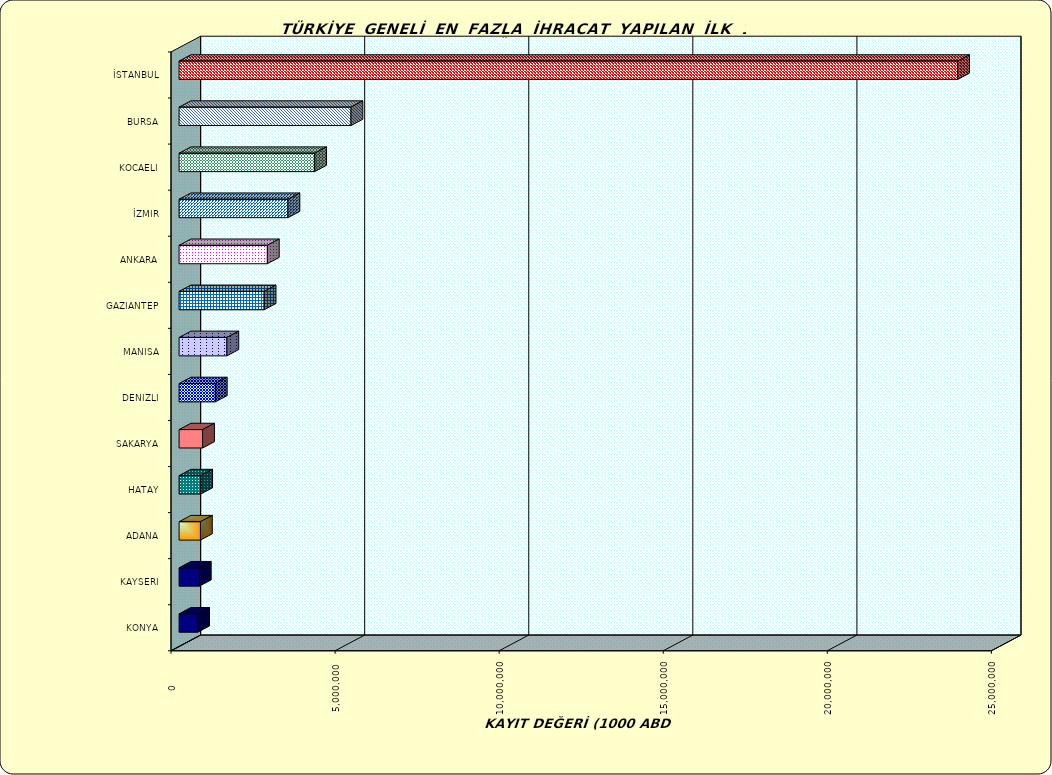
| Category | Series 0 |
|---|---|
| İSTANBUL | 23724002.607 |
| BURSA | 5239314.157 |
| KOCAELI | 4132918.852 |
| İZMIR | 3318704.823 |
| ANKARA | 2690449.56 |
| GAZIANTEP | 2592181.111 |
| MANISA | 1456604.149 |
| DENIZLI | 1103421.894 |
| SAKARYA | 716445.685 |
| HATAY | 659504.662 |
| ADANA | 651366.242 |
| KAYSERI | 615848.054 |
| KONYA | 566560.209 |